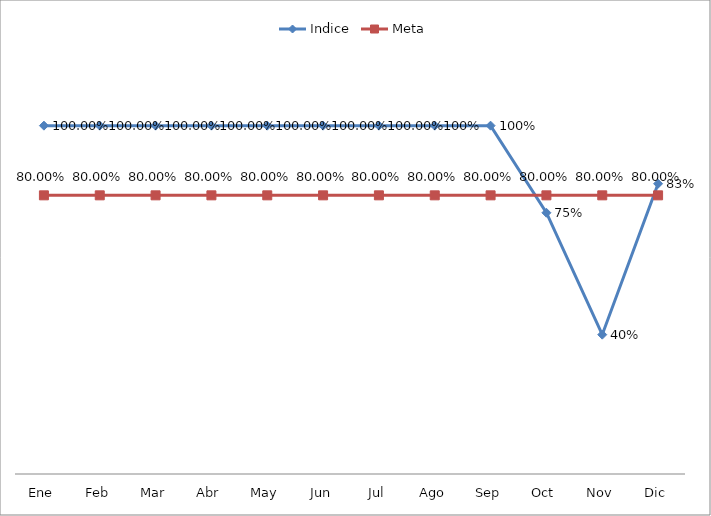
| Category | Indice | Meta |
|---|---|---|
| Ene | 1 | 0.8 |
| Feb | 1 | 0.8 |
| Mar | 1 | 0.8 |
| Abr | 1 | 0.8 |
| May | 1 | 0.8 |
| Jun | 1 | 0.8 |
| Jul | 1 | 0.8 |
| Ago | 1 | 0.8 |
| Sep | 1 | 0.8 |
| Oct | 0.75 | 0.8 |
| Nov | 0.4 | 0.8 |
| Dic | 0.833 | 0.8 |